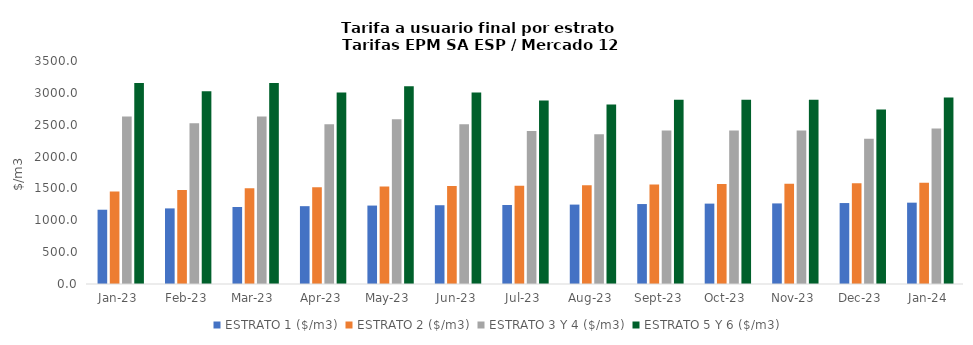
| Category | ESTRATO 1 ($/m3) | ESTRATO 2 ($/m3) | ESTRATO 3 Y 4 ($/m3) | ESTRATO 5 Y 6 ($/m3) |
|---|---|---|---|---|
| 2023-01-01 | 1165.79 | 1451.1 | 2629.41 | 3155.292 |
| 2023-02-01 | 1186.59 | 1476.94 | 2522.44 | 3026.928 |
| 2023-03-01 | 1208.96 | 1503.32 | 2629.41 | 3155.292 |
| 2023-04-01 | 1221.6 | 1518.97 | 2505.94 | 3007.128 |
| 2023-05-01 | 1231.01 | 1530.94 | 2586.17 | 3103.404 |
| 2023-06-01 | 1236.39 | 1537.58 | 2505.94 | 3007.128 |
| 2023-07-01 | 1240.07 | 1542.24 | 2401.05 | 2881.26 |
| 2023-08-01 | 1246.26 | 1549.97 | 2349.35 | 2819.22 |
| 2023-09-01 | 1254.93 | 1560.74 | 2408.97 | 2890.764 |
| 2023-10-01 | 1261.68 | 1568.93 | 2408.97 | 2890.764 |
| 2023-11-01 | 1264.8 | 1572.96 | 2408.97 | 2890.764 |
| 2023-12-01 | 1270.61 | 1580.3 | 2281.06 | 2737.272 |
| 2024-01-01 | 1276.56 | 1587.59 | 2438.92 | 2926.704 |